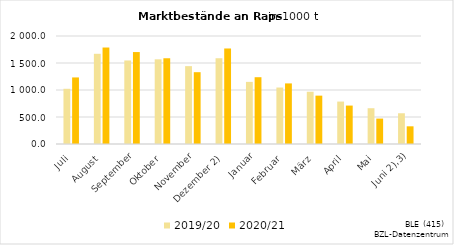
| Category | 2019/20 | 2020/21 |
|---|---|---|
| Juli | 1022.43 | 1232.625 |
| August | 1670.48 | 1786.687 |
| September | 1546.896 | 1702.583 |
| Oktober | 1568.403 | 1587.848 |
| November | 1441.768 | 1329.796 |
|  Dezember 2) | 1588.226 | 1768.91 |
| Januar | 1150.217 | 1236.784 |
| Februar | 1045.611 | 1122.025 |
| März | 967.689 | 895.482 |
| April | 785.799 | 711.552 |
| Mai | 662.389 | 470.471 |
|    Juni 2),3) | 569.181 | 327.521 |